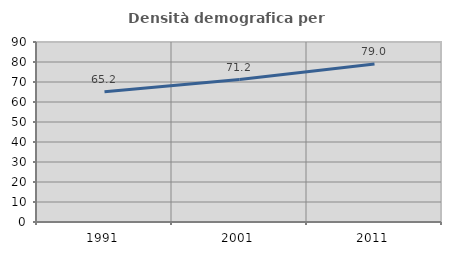
| Category | Densità demografica |
|---|---|
| 1991.0 | 65.184 |
| 2001.0 | 71.214 |
| 2011.0 | 78.967 |